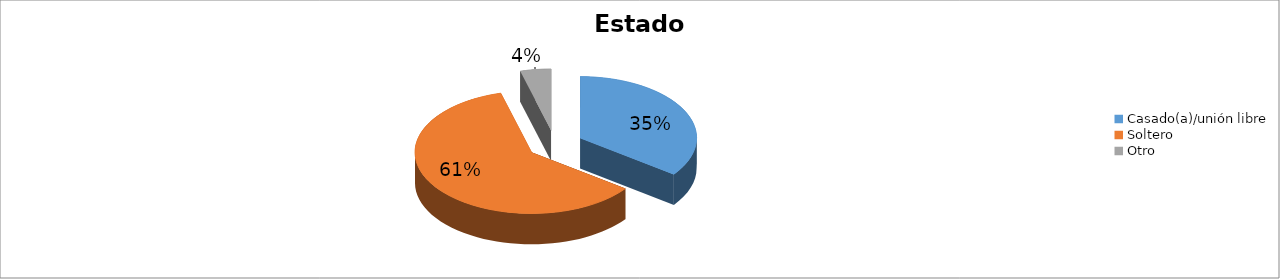
| Category | Series 0 |
|---|---|
| Casado(a)/unión libre | 0.351 |
| Soltero | 0.606 |
| Otro | 0.043 |